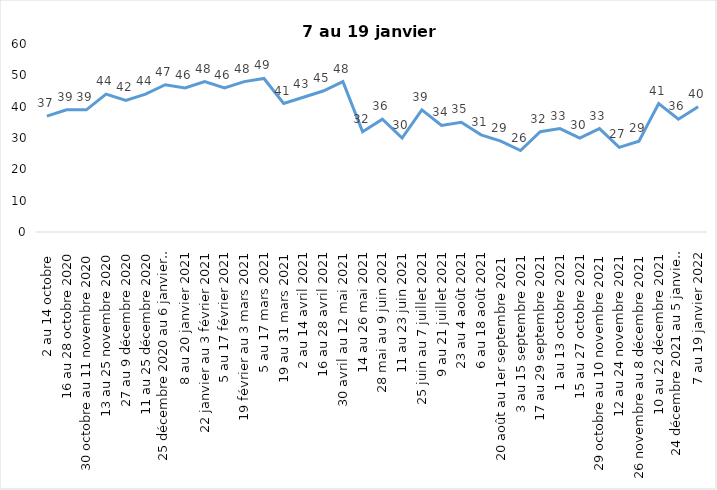
| Category | Toujours aux trois mesures |
|---|---|
| 2 au 14 octobre  | 37 |
| 16 au 28 octobre 2020 | 39 |
| 30 octobre au 11 novembre 2020 | 39 |
| 13 au 25 novembre 2020 | 44 |
| 27 au 9 décembre 2020 | 42 |
| 11 au 25 décembre 2020 | 44 |
| 25 décembre 2020 au 6 janvier  2021 | 47 |
| 8 au 20 janvier 2021 | 46 |
| 22 janvier au 3 février 2021 | 48 |
| 5 au 17 février 2021 | 46 |
| 19 février au 3 mars 2021 | 48 |
| 5 au 17 mars 2021 | 49 |
| 19 au 31 mars 2021 | 41 |
| 2 au 14 avril 2021 | 43 |
| 16 au 28 avril 2021 | 45 |
| 30 avril au 12 mai 2021 | 48 |
| 14 au 26 mai 2021 | 32 |
| 28 mai au 9 juin 2021 | 36 |
| 11 au 23 juin 2021 | 30 |
| 25 juin au 7 juillet 2021 | 39 |
| 9 au 21 juillet 2021 | 34 |
| 23 au 4 août 2021 | 35 |
| 6 au 18 août 2021 | 31 |
| 20 août au 1er septembre 2021 | 29 |
| 3 au 15 septembre 2021 | 26 |
| 17 au 29 septembre 2021 | 32 |
| 1 au 13 octobre 2021 | 33 |
| 15 au 27 octobre 2021 | 30 |
| 29 octobre au 10 novembre 2021 | 33 |
| 12 au 24 novembre 2021 | 27 |
| 26 novembre au 8 décembre 2021 | 29 |
| 10 au 22 décembre 2021 | 41 |
| 24 décembre 2021 au 5 janvier 2022 | 36 |
| 7 au 19 janvier 2022 | 40 |